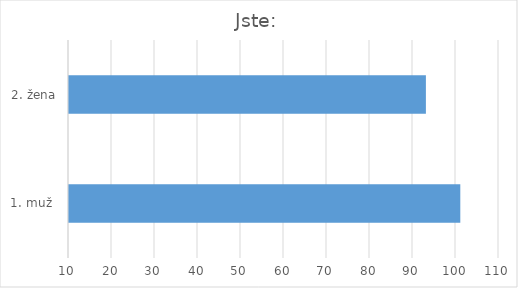
| Category | Series 0 |
|---|---|
| 1. muž  | 101 |
| 2. žena | 93 |